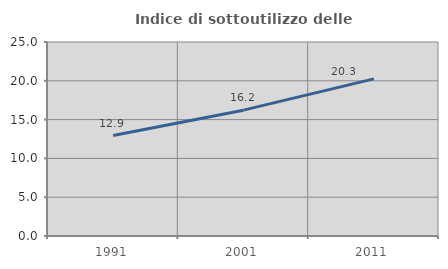
| Category | Indice di sottoutilizzo delle abitazioni  |
|---|---|
| 1991.0 | 12.941 |
| 2001.0 | 16.216 |
| 2011.0 | 20.253 |